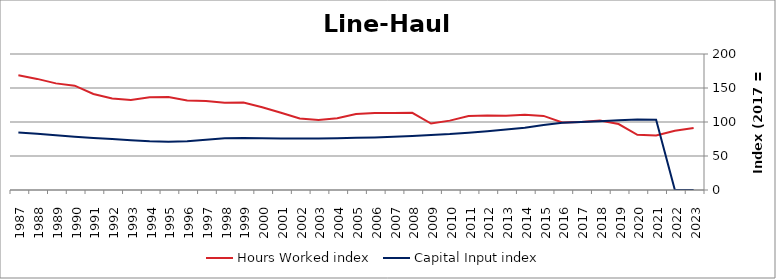
| Category | Hours Worked index | Capital Input index |
|---|---|---|
| 2023.0 | 91.245 | 0 |
| 2022.0 | 87.138 | 0 |
| 2021.0 | 80.232 | 103.444 |
| 2020.0 | 81.216 | 103.725 |
| 2019.0 | 96.981 | 102.607 |
| 2018.0 | 102.152 | 101.185 |
| 2017.0 | 100 | 100 |
| 2016.0 | 99.239 | 98.811 |
| 2015.0 | 108.929 | 95.439 |
| 2014.0 | 110.688 | 91.385 |
| 2013.0 | 109.071 | 88.83 |
| 2012.0 | 109.402 | 86.53 |
| 2011.0 | 108.896 | 84.21 |
| 2010.0 | 102.001 | 82.188 |
| 2009.0 | 97.732 | 80.808 |
| 2008.0 | 113.423 | 79.468 |
| 2007.0 | 113.344 | 78.439 |
| 2006.0 | 113.267 | 77.356 |
| 2005.0 | 111.632 | 76.733 |
| 2004.0 | 105.41 | 76.266 |
| 2003.0 | 102.868 | 75.852 |
| 2002.0 | 105.109 | 75.733 |
| 2001.0 | 113.601 | 75.615 |
| 2000.0 | 121.811 | 76.174 |
| 1999.0 | 128.815 | 76.632 |
| 1998.0 | 128.256 | 76.129 |
| 1997.0 | 130.926 | 73.935 |
| 1996.0 | 131.597 | 71.624 |
| 1995.0 | 136.889 | 71.101 |
| 1994.0 | 136.218 | 71.591 |
| 1993.0 | 132.451 | 73.203 |
| 1992.0 | 134.59 | 75.002 |
| 1991.0 | 141.191 | 76.639 |
| 1990.0 | 153.395 | 78.463 |
| 1989.0 | 156.799 | 80.568 |
| 1988.0 | 163.387 | 82.608 |
| 1987.0 | 168.625 | 84.397 |